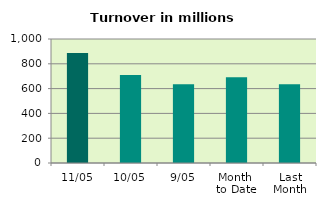
| Category | Series 0 |
|---|---|
| 11/05 | 887.048 |
| 10/05 | 709.113 |
| 9/05 | 634.926 |
| Month 
to Date | 691.746 |
| Last
Month | 634.312 |